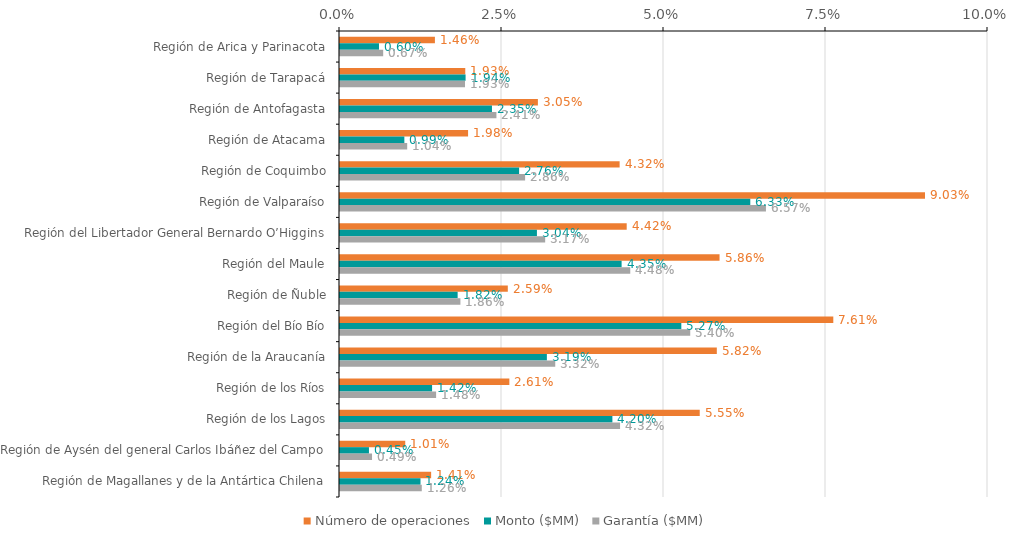
| Category | Número de operaciones | Monto ($MM) | Garantía ($MM) |
|---|---|---|---|
| Región de Arica y Parinacota | 0.015 | 0.006 | 0.007 |
| Región de Tarapacá | 0.019 | 0.019 | 0.019 |
| Región de Antofagasta | 0.031 | 0.023 | 0.024 |
| Región de Atacama | 0.02 | 0.01 | 0.01 |
| Región de Coquimbo | 0.043 | 0.028 | 0.029 |
| Región de Valparaíso | 0.09 | 0.063 | 0.066 |
| Región del Libertador General Bernardo O’Higgins | 0.044 | 0.03 | 0.032 |
| Región del Maule | 0.059 | 0.043 | 0.045 |
| Región de Ñuble | 0.026 | 0.018 | 0.019 |
| Región del Bío Bío | 0.076 | 0.053 | 0.054 |
| Región de la Araucanía | 0.058 | 0.032 | 0.033 |
| Región de los Ríos | 0.026 | 0.014 | 0.015 |
| Región de los Lagos | 0.056 | 0.042 | 0.043 |
| Región de Aysén del general Carlos Ibáñez del Campo | 0.01 | 0.004 | 0.005 |
| Región de Magallanes y de la Antártica Chilena | 0.014 | 0.012 | 0.013 |